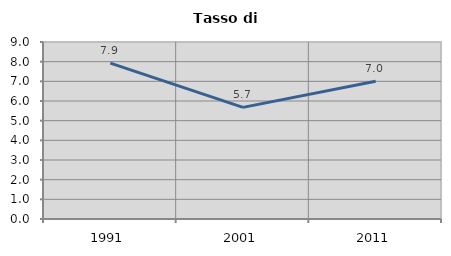
| Category | Tasso di disoccupazione   |
|---|---|
| 1991.0 | 7.93 |
| 2001.0 | 5.677 |
| 2011.0 | 7.006 |